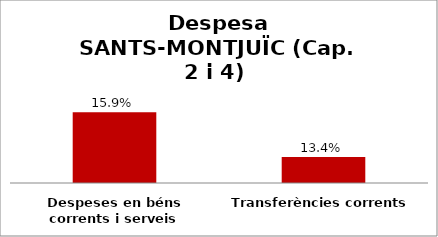
| Category | Series 0 |
|---|---|
| Despeses en béns corrents i serveis | 0.159 |
| Transferències corrents | 0.134 |